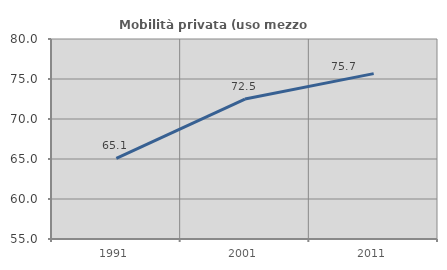
| Category | Mobilità privata (uso mezzo privato) |
|---|---|
| 1991.0 | 65.066 |
| 2001.0 | 72.493 |
| 2011.0 | 75.673 |